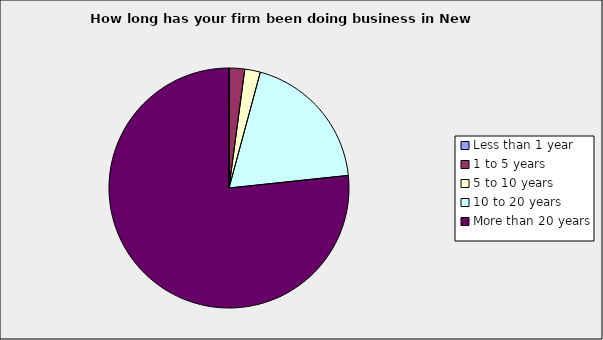
| Category | Series 0 |
|---|---|
| Less than 1 year | 0 |
| 1 to 5 years | 0.021 |
| 5 to 10 years | 0.021 |
| 10 to 20 years | 0.191 |
| More than 20 years | 0.766 |